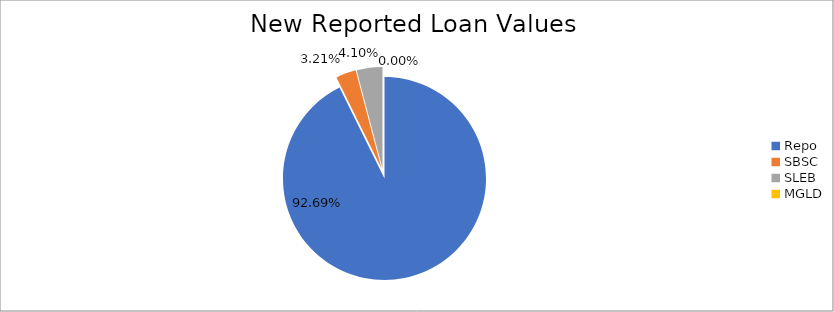
| Category | Series 0 |
|---|---|
| Repo | 9283326.882 |
| SBSC | 321171.218 |
| SLEB | 410974.842 |
| MGLD | 109.073 |